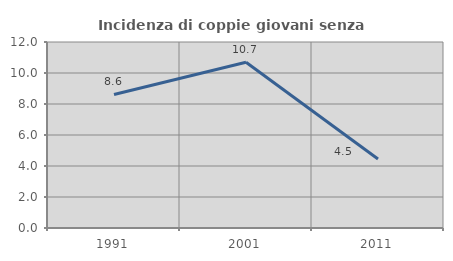
| Category | Incidenza di coppie giovani senza figli |
|---|---|
| 1991.0 | 8.615 |
| 2001.0 | 10.69 |
| 2011.0 | 4.457 |